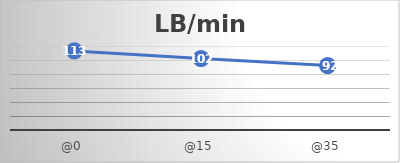
| Category | LB/min |
|---|---|
| @0 | 113 |
| @15 | 102 |
| @35 | 92 |